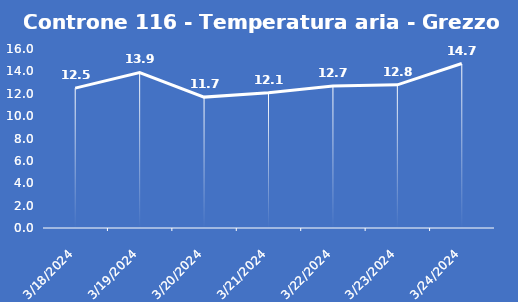
| Category | Controne 116 - Temperatura aria - Grezzo (°C) |
|---|---|
| 3/18/24 | 12.5 |
| 3/19/24 | 13.9 |
| 3/20/24 | 11.7 |
| 3/21/24 | 12.1 |
| 3/22/24 | 12.7 |
| 3/23/24 | 12.8 |
| 3/24/24 | 14.7 |